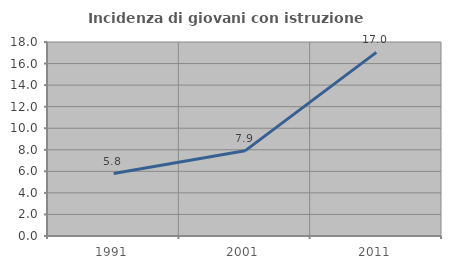
| Category | Incidenza di giovani con istruzione universitaria |
|---|---|
| 1991.0 | 5.792 |
| 2001.0 | 7.903 |
| 2011.0 | 17.037 |